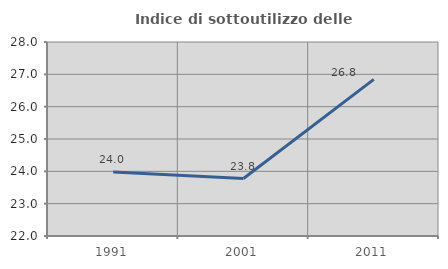
| Category | Indice di sottoutilizzo delle abitazioni  |
|---|---|
| 1991.0 | 23.977 |
| 2001.0 | 23.778 |
| 2011.0 | 26.845 |